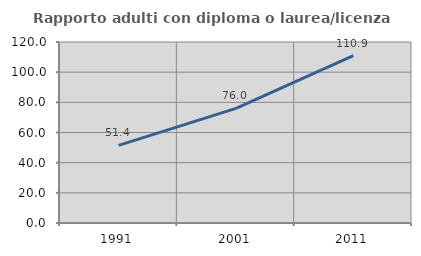
| Category | Rapporto adulti con diploma o laurea/licenza media  |
|---|---|
| 1991.0 | 51.429 |
| 2001.0 | 76.011 |
| 2011.0 | 110.9 |